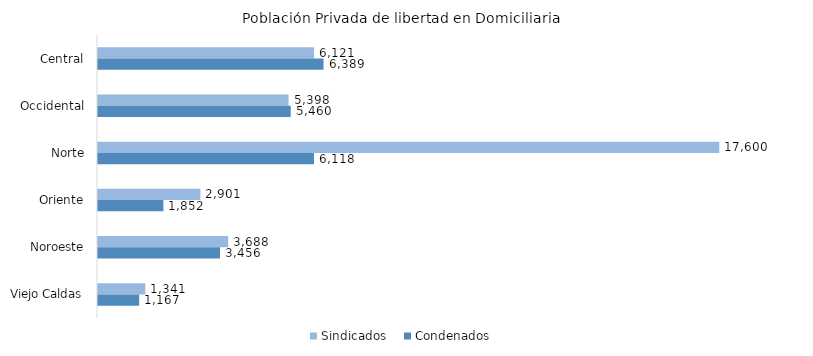
| Category | Sindicados | Condenados |
|---|---|---|
| Central | 6121 | 6389 |
| Occidental | 5398 | 5460 |
| Norte | 17600 | 6118 |
| Oriente | 2901 | 1852 |
| Noroeste | 3688 | 3456 |
| Viejo Caldas | 1341 | 1167 |